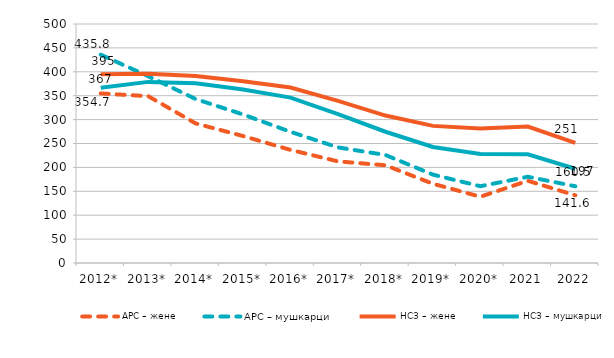
| Category | АРС – жене  | АРС – мушкарци | НСЗ – жене  | НСЗ – мушкарци |
|---|---|---|---|---|
| 2012* | 354.7 | 435.8 | 394.992 | 366.841 |
| 2013* | 349 | 390.8 | 395.985 | 378.905 |
| 2014* | 292 | 343.1 | 391.279 | 376.156 |
| 2015* | 265.6 | 310.7 | 380.274 | 362.884 |
| 2016* | 236.6 | 274.4 | 367.096 | 346.057 |
| 2017* | 212.6 | 241.8 | 339.047 | 311.525 |
| 2018* | 204.4 | 226 | 308.49 | 274.608 |
| 2019* | 165.8 | 184.9 | 286.872 | 242.635 |
| 2020* | 138.6 | 160.6 | 281.219 | 227.96 |
| 2021 | 171.996 | 180.422 | 285.323 | 227.521 |
| 2022 | 141.63 | 160.536 | 251.414 | 197.204 |